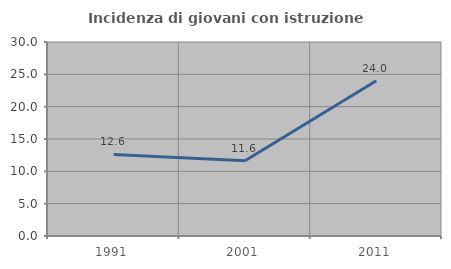
| Category | Incidenza di giovani con istruzione universitaria |
|---|---|
| 1991.0 | 12.613 |
| 2001.0 | 11.628 |
| 2011.0 | 24 |